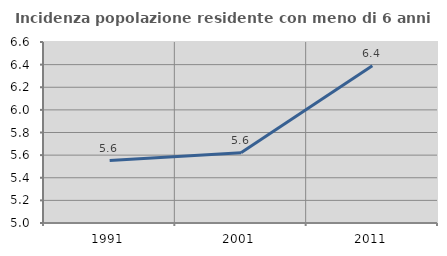
| Category | Incidenza popolazione residente con meno di 6 anni |
|---|---|
| 1991.0 | 5.552 |
| 2001.0 | 5.621 |
| 2011.0 | 6.391 |